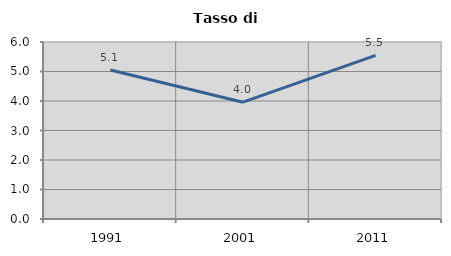
| Category | Tasso di disoccupazione   |
|---|---|
| 1991.0 | 5.052 |
| 2001.0 | 3.96 |
| 2011.0 | 5.547 |